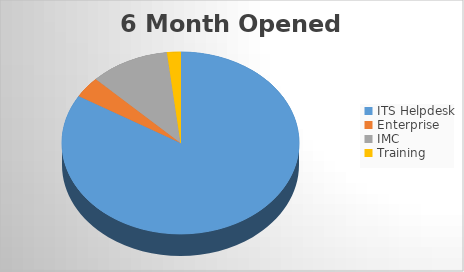
| Category | 6M Opened |
|---|---|
| ITS Helpdesk | 1544 |
| Enterprise | 69 |
| IMC | 200 |
| Training | 34 |